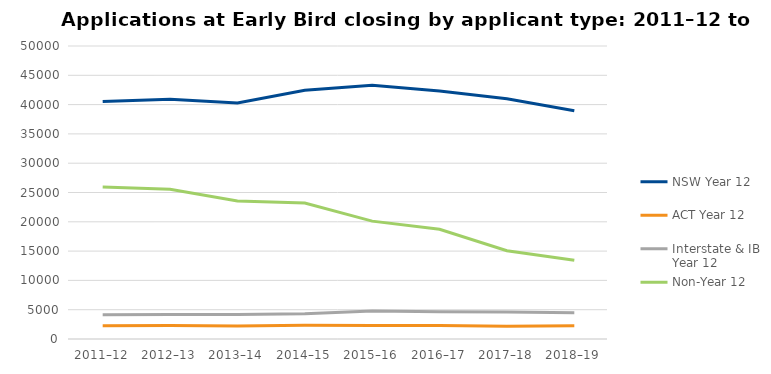
| Category | NSW Year 12 | ACT Year 12 | Interstate & IB Year 12 | Non-Year 12 |
|---|---|---|---|---|
| 2011–12 | 40535 | 2280 | 4137 | 25949 |
| 2012–13 | 40895 | 2308 | 4195 | 25567 |
| 2013–14 | 40264 | 2216 | 4168 | 23542 |
| 2014–15 | 42458 | 2365 | 4318 | 23202 |
| 2015–16 | 43303 | 2288 | 4783 | 20115 |
| 2016–17 | 42339 | 2306 | 4670 | 18727 |
| 2017–18 | 40989 | 2168 | 4599 | 15071 |
| 2018–19 | 38964 | 2263 | 4492 | 13424 |